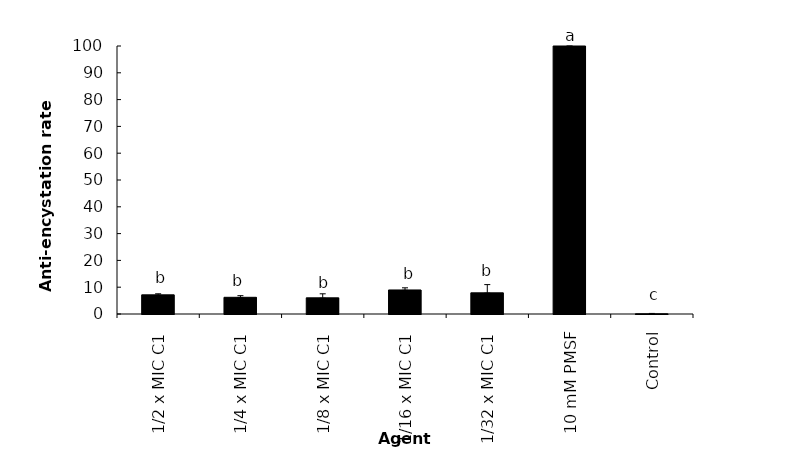
| Category | Series 0 |
|---|---|
| 1/2 x MIC C1 | 7.144 |
| 1/4 x MIC C1 | 6.232 |
| 1/8 x MIC C1 | 6.029 |
| 1/16 x MIC C1 | 8.972 |
| 1/32 x MIC C1 | 7.895 |
| 10 mM PMSF | 100 |
| Control | 0.066 |